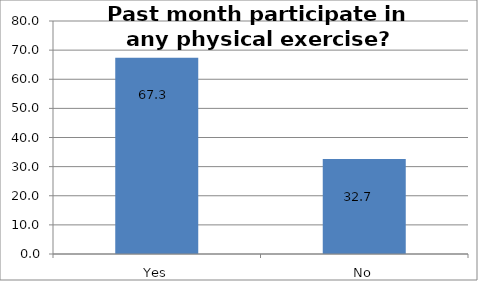
| Category | Series 0 |
|---|---|
| Yes | 67.343 |
| No | 32.657 |